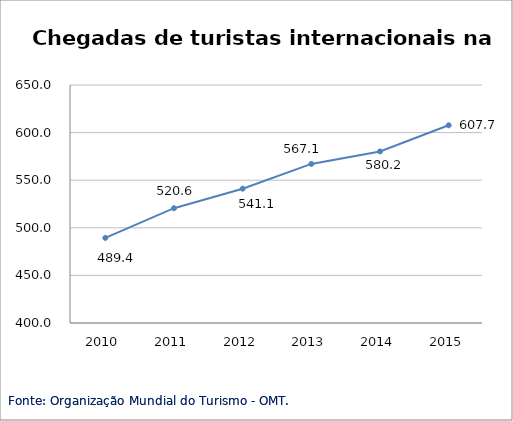
| Category | Europa |
|---|---|
| 2010.0 | 489.4 |
| 2011.0 | 520.6 |
| 2012.0 | 541.1 |
| 2013.0 | 567.1 |
| 2014.0 | 580.2 |
| 2015.0 | 607.7 |